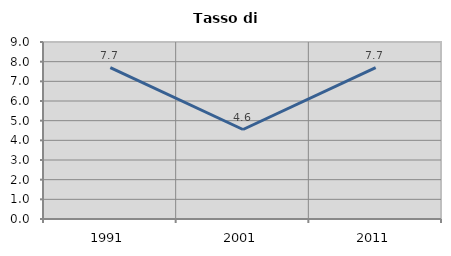
| Category | Tasso di disoccupazione   |
|---|---|
| 1991.0 | 7.701 |
| 2001.0 | 4.55 |
| 2011.0 | 7.692 |